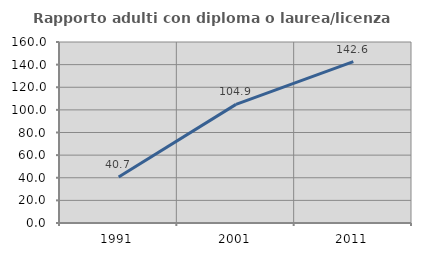
| Category | Rapporto adulti con diploma o laurea/licenza media  |
|---|---|
| 1991.0 | 40.681 |
| 2001.0 | 104.878 |
| 2011.0 | 142.64 |